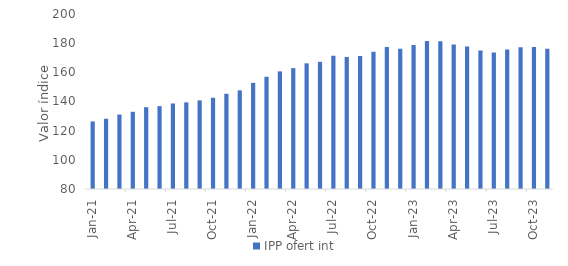
| Category | IPP ofert int |
|---|---|
| 2021-01-01 | 126.36 |
| 2021-02-01 | 128.19 |
| 2021-03-01 | 131.04 |
| 2021-04-01 | 132.94 |
| 2021-05-01 | 136.1 |
| 2021-06-01 | 136.81 |
| 2021-07-01 | 138.63 |
| 2021-08-01 | 139.38 |
| 2021-09-01 | 140.73 |
| 2021-10-01 | 142.56 |
| 2021-11-01 | 145.3 |
| 2021-12-01 | 147.65 |
| 2022-01-01 | 152.8 |
| 2022-02-01 | 156.94 |
| 2022-03-01 | 160.65 |
| 2022-04-01 | 162.89 |
| 2022-05-01 | 166.16 |
| 2022-06-01 | 167.21 |
| 2022-07-01 | 171.4 |
| 2022-08-01 | 170.53 |
| 2022-09-01 | 171.26 |
| 2022-10-01 | 174.12 |
| 2022-11-01 | 177.36 |
| 2022-12-01 | 176.17 |
| 2023-01-01 | 178.736 |
| 2023-02-01 | 181.43 |
| 2023-03-01 | 181.36 |
| 2023-04-01 | 179.17 |
| 2023-05-01 | 177.7 |
| 2023-06-01 | 174.91 |
| 2023-07-01 | 173.52 |
| 2023-08-01 | 175.6 |
| 2023-09-01 | 177.12 |
| 2023-10-01 | 177.43 |
| 2023-11-01 | 176.2 |